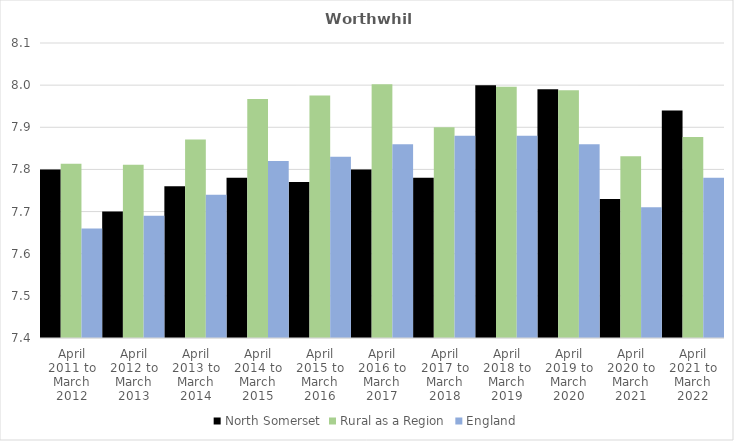
| Category | North Somerset | Rural as a Region | England |
|---|---|---|---|
| April 2011 to March 2012 | 7.8 | 7.813 | 7.66 |
| April 2012 to March 2013 | 7.7 | 7.811 | 7.69 |
| April 2013 to March 2014 | 7.76 | 7.871 | 7.74 |
| April 2014 to March 2015 | 7.78 | 7.967 | 7.82 |
| April 2015 to March 2016 | 7.77 | 7.975 | 7.83 |
| April 2016 to March 2017 | 7.8 | 8.002 | 7.86 |
| April 2017 to March 2018 | 7.78 | 7.9 | 7.88 |
| April 2018 to March 2019 | 8 | 7.996 | 7.88 |
| April 2019 to March 2020 | 7.99 | 7.988 | 7.86 |
| April 2020 to March 2021 | 7.73 | 7.831 | 7.71 |
| April 2021 to March 2022 | 7.94 | 7.877 | 7.78 |